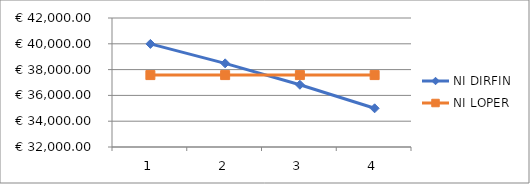
| Category | NI DIRFIN | NI LOPER |
|---|---|---|
| 0 | 39992.459 | 37575.3 |
| 1 | 38484.163 | 37575.3 |
| 2 | 36825.038 | 37575.3 |
| 3 | 35000 | 37575.3 |